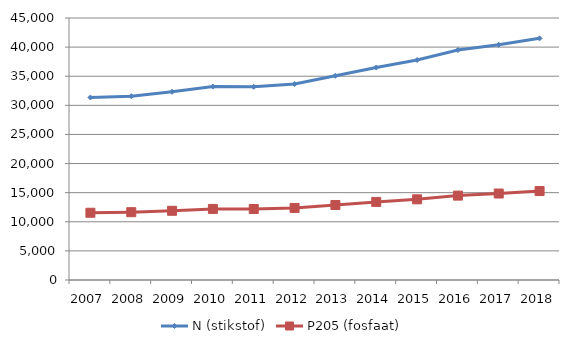
| Category | N (stikstof) | P205 (fosfaat) |
|---|---|---|
| 2007.0 | 31345.956 | 11548.752 |
| 2008.0 | 31578.883 | 11646.305 |
| 2009.0 | 32328.631 | 11887.752 |
| 2010.0 | 33220.717 | 12207.041 |
| 2011.0 | 33184.131 | 12196.083 |
| 2012.0 | 33656.701 | 12374.943 |
| 2013.0 | 35069.459 | 12883.546 |
| 2014.0 | 36499.76 | 13413.182 |
| 2015.0 | 37781.391 | 13856.657 |
| 2016.0 | 39501.344 | 14492.609 |
| 2017.0 | 40403.958 | 14851.829 |
| 2018.0 | 41503.816 | 15277.563 |